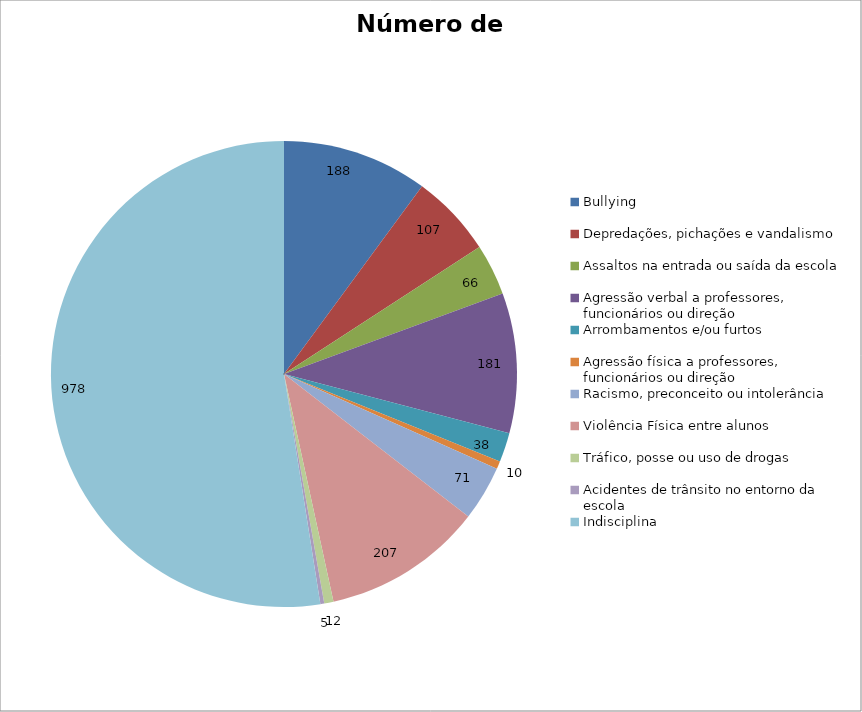
| Category | Número de Casos |
|---|---|
| Bullying | 188 |
| Depredações, pichações e vandalismo | 107 |
| Assaltos na entrada ou saída da escola | 66 |
| Agressão verbal a professores, funcionários ou direção | 181 |
| Arrombamentos e/ou furtos | 38 |
| Agressão física a professores, funcionários ou direção | 10 |
| Racismo, preconceito ou intolerância | 71 |
| Violência Física entre alunos | 207 |
| Tráfico, posse ou uso de drogas | 12 |
| Acidentes de trânsito no entorno da escola | 5 |
| Indisciplina | 978 |